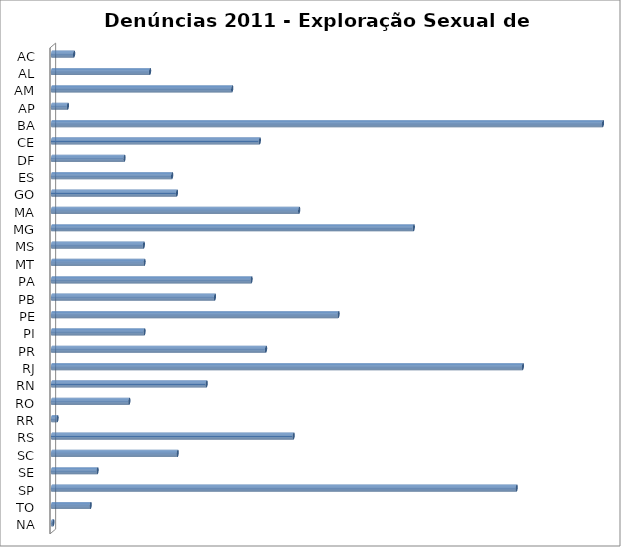
| Category | Series 0 |
|---|---|
| AC | 32 |
| AL | 142 |
| AM | 261 |
| AP | 23 |
| BA | 798 |
| CE | 301 |
| DF | 105 |
| ES | 174 |
| GO | 181 |
| MA | 358 |
| MG | 524 |
| MS | 133 |
| MT | 134 |
| PA | 289 |
| PB | 236 |
| PE | 415 |
| PI | 134 |
| PR | 310 |
| RJ | 682 |
| RN | 224 |
| RO | 112 |
| RR | 8 |
| RS | 350 |
| SC | 182 |
| SE | 66 |
| SP | 673 |
| TO | 56 |
| NA | 2 |